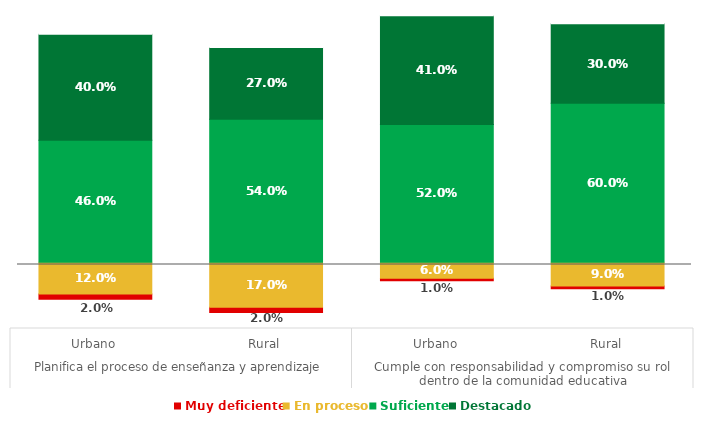
| Category | Series 0 | Muy deficiente | En proceso | Suficiente | Destacado | Series 5 |
|---|---|---|---|---|---|---|
| 0 | 0.11 | 0.02 | 0.12 | 0.46 | 0.4 | 0.14 |
| 1 | 0.06 | 0.02 | 0.17 | 0.54 | 0.27 | 0.19 |
| 2 | 0.18 | 0.01 | 0.06 | 0.52 | 0.41 | 0.07 |
| 3 | 0.15 | 0.01 | 0.09 | 0.6 | 0.3 | 0.1 |